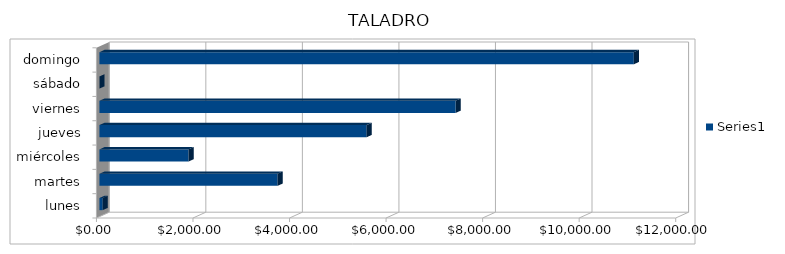
| Category | Series 0 |
|---|---|
| lunes | 66.42 |
| martes | 3690 |
| miércoles | 1845 |
| jueves | 5535 |
| viernes | 7380 |
| sábado | 0 |
| domingo | 11070 |